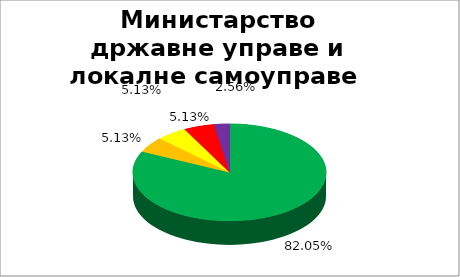
| Category | Министарство државне управе и локалне самоуправе  |
|---|---|
| 0 | 0.821 |
| 1 | 0.051 |
| 2 | 0.051 |
| 3 | 0.051 |
| 4 | 0.026 |